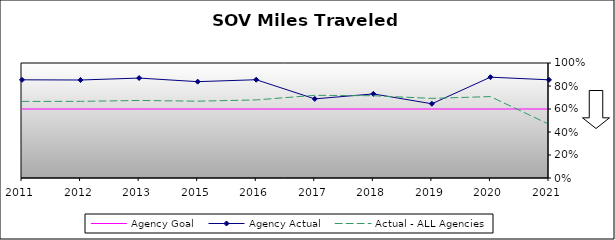
| Category | Agency Goal | Agency Actual | Actual - ALL Agencies |
|---|---|---|---|
| 2011.0 | 0.6 | 0.854 | 0.666 |
| 2012.0 | 0.6 | 0.852 | 0.666 |
| 2013.0 | 0.6 | 0.869 | 0.674 |
| 2015.0 | 0.6 | 0.838 | 0.668 |
| 2016.0 | 0.6 | 0.855 | 0.679 |
| 2017.0 | 0.6 | 0.688 | 0.719 |
| 2018.0 | 0.6 | 0.731 | 0.715 |
| 2019.0 | 0.6 | 0.645 | 0.692 |
| 2020.0 | 0.6 | 0.877 | 0.708 |
| 2021.0 | 0.6 | 0.854 | 0.467 |